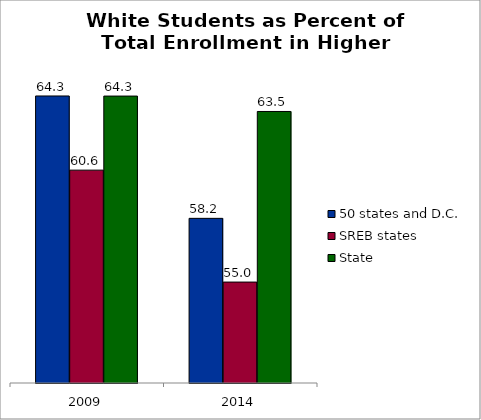
| Category | 50 states and D.C. | SREB states | State |
|---|---|---|---|
| 2009 | 64.307 | 60.61 | 64.302 |
| 2014 | 58.206 | 55.03 | 63.534 |